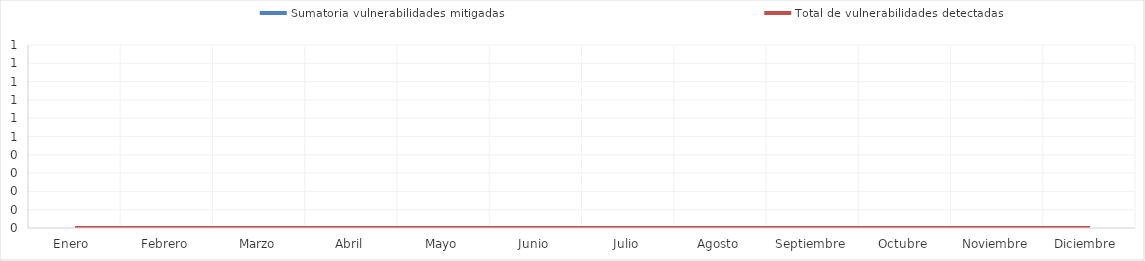
| Category | Sumatoria vulnerabilidades mitigadas | Total de vulnerabilidades detectadas |
|---|---|---|
| Enero  | 0 | 0 |
| Febrero | 0 | 0 |
| Marzo | 0 | 0 |
| Abril | 0 | 0 |
| Mayo | 0 | 0 |
| Junio | 0 | 0 |
| Julio | 0 | 0 |
| Agosto | 0 | 0 |
| Septiembre | 0 | 0 |
| Octubre | 0 | 0 |
| Noviembre | 0 | 0 |
| Diciembre  | 0 | 0 |